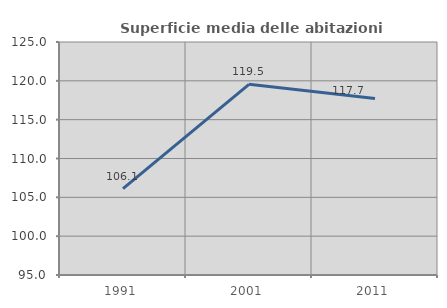
| Category | Superficie media delle abitazioni occupate |
|---|---|
| 1991.0 | 106.125 |
| 2001.0 | 119.549 |
| 2011.0 | 117.717 |